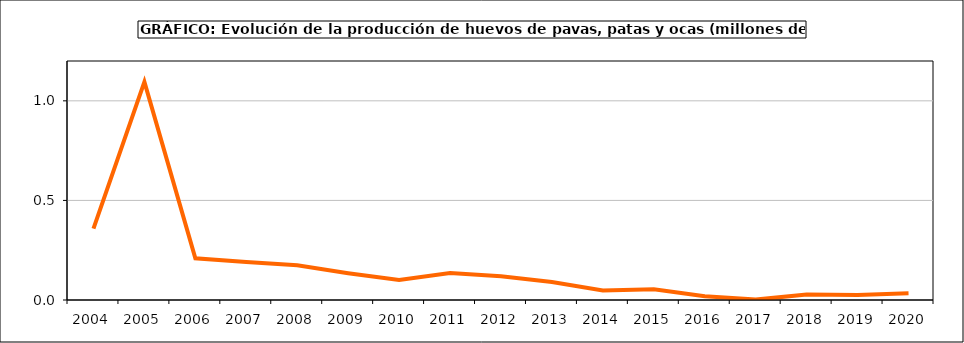
| Category | huevos |
|---|---|
| 2004.0 | 0.358 |
| 2005.0 | 1.095 |
| 2006.0 | 0.209 |
| 2007.0 | 0.191 |
| 2008.0 | 0.174 |
| 2009.0 | 0.135 |
| 2010.0 | 0.1 |
| 2011.0 | 0.135 |
| 2012.0 | 0.119 |
| 2013.0 | 0.09 |
| 2014.0 | 0.047 |
| 2015.0 | 0.054 |
| 2016.0 | 0.019 |
| 2017.0 | 0.002 |
| 2018.0 | 0.027 |
| 2019.0 | 0.026 |
| 2020.0 | 0.034 |